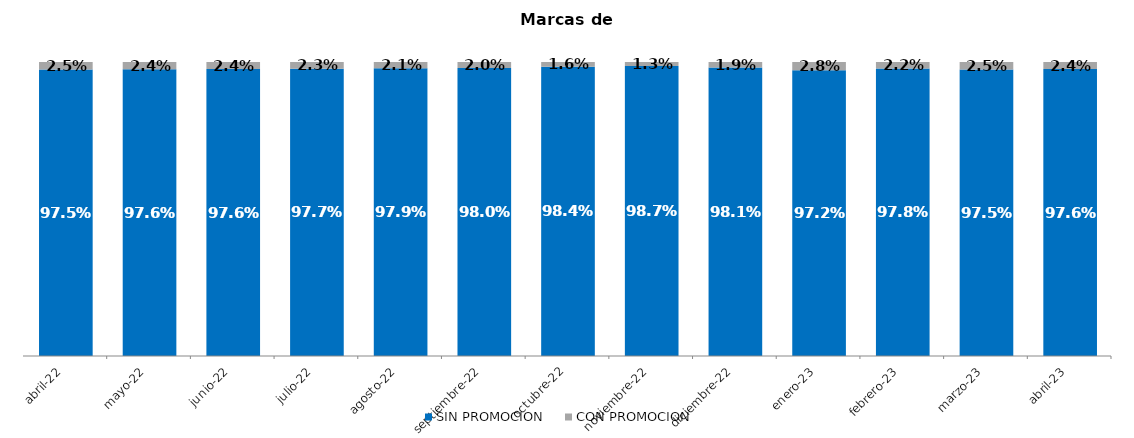
| Category | SIN PROMOCION   | CON PROMOCION   |
|---|---|---|
| 2022-04-01 | 0.975 | 0.025 |
| 2022-05-01 | 0.976 | 0.024 |
| 2022-06-01 | 0.976 | 0.024 |
| 2022-07-01 | 0.977 | 0.023 |
| 2022-08-01 | 0.979 | 0.021 |
| 2022-09-01 | 0.98 | 0.02 |
| 2022-10-01 | 0.984 | 0.016 |
| 2022-11-01 | 0.987 | 0.013 |
| 2022-12-01 | 0.981 | 0.019 |
| 2023-01-01 | 0.972 | 0.028 |
| 2023-02-01 | 0.978 | 0.022 |
| 2023-03-01 | 0.975 | 0.025 |
| 2023-04-01 | 0.976 | 0.024 |